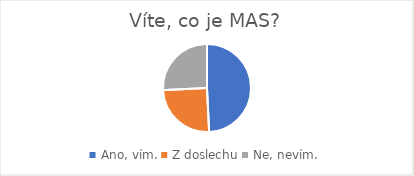
| Category | Víte, co je MAS? |
|---|---|
| Ano, vím. | 128 |
| Z doslechu | 65 |
| Ne, nevím. | 67 |